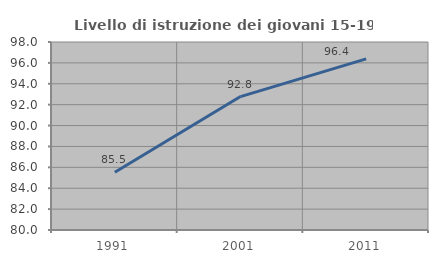
| Category | Livello di istruzione dei giovani 15-19 anni |
|---|---|
| 1991.0 | 85.532 |
| 2001.0 | 92.774 |
| 2011.0 | 96.381 |